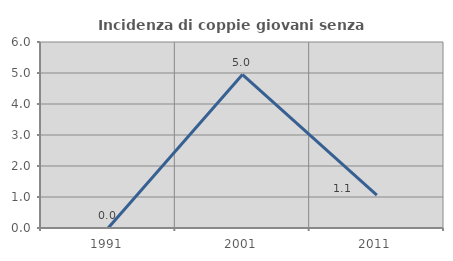
| Category | Incidenza di coppie giovani senza figli |
|---|---|
| 1991.0 | 0 |
| 2001.0 | 4.95 |
| 2011.0 | 1.064 |